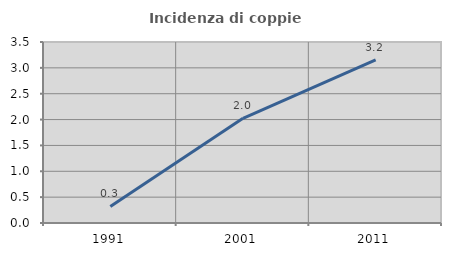
| Category | Incidenza di coppie miste |
|---|---|
| 1991.0 | 0.32 |
| 2001.0 | 2.023 |
| 2011.0 | 3.155 |